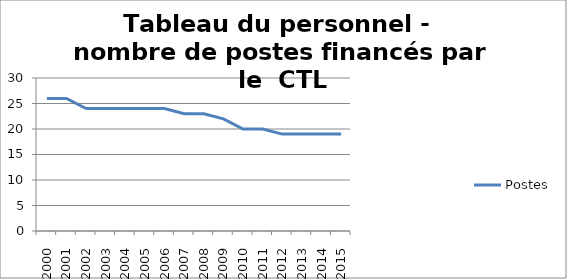
| Category | Postes |
|---|---|
| 2000.0 | 26 |
| 2001.0 | 26 |
| 2002.0 | 24 |
| 2003.0 | 24 |
| 2004.0 | 24 |
| 2005.0 | 24 |
| 2006.0 | 24 |
| 2007.0 | 23 |
| 2008.0 | 23 |
| 2009.0 | 22 |
| 2010.0 | 20 |
| 2011.0 | 20 |
| 2012.0 | 19 |
| 2013.0 | 19 |
| 2014.0 | 19 |
| 2015.0 | 19 |